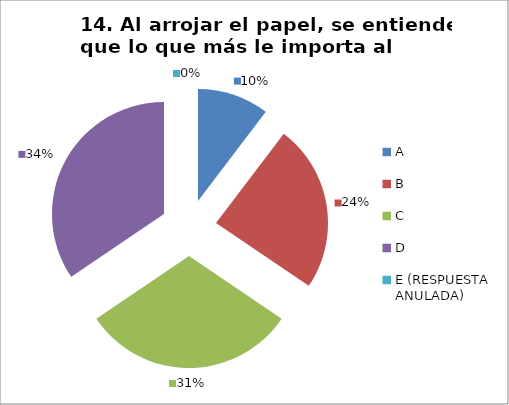
| Category | CANTIDAD DE RESPUESTAS PREGUNTA (14) | PORCENTAJE |
|---|---|---|
| A | 3 | 0.103 |
| B | 7 | 0.241 |
| C | 9 | 0.31 |
| D | 10 | 0.345 |
| E (RESPUESTA ANULADA) | 0 | 0 |